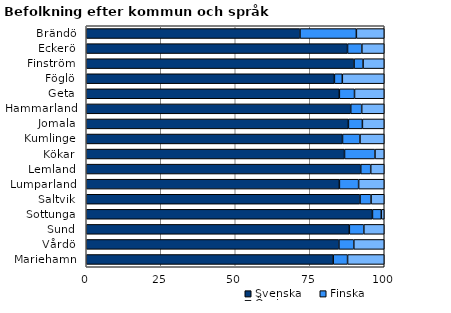
| Category | Svenska | Finska | Övriga |
|---|---|---|---|
| Brändö | 71.715 | 18.931 | 9.354 |
| Eckerö | 87.683 | 4.802 | 7.516 |
| Finström | 89.858 | 3.035 | 7.107 |
| Föglö | 83.27 | 2.662 | 14.068 |
| Geta | 84.932 | 5.088 | 9.98 |
| Hammarland | 88.743 | 3.69 | 7.567 |
| Jomala | 87.969 | 4.697 | 7.334 |
| Kumlinge | 85.993 | 5.863 | 8.143 |
| Kökar | 86.667 | 10.222 | 3.111 |
| Lemland | 92.1 | 3.359 | 4.541 |
| Lumparland | 84.946 | 6.452 | 8.602 |
| Saltvik | 91.86 | 3.71 | 4.43 |
| Sottunga | 96.04 | 2.97 | 0.99 |
| Sund | 88.282 | 4.866 | 6.852 |
| Vårdö | 84.783 | 5 | 10.217 |
| Mariehamn | 82.862 | 4.827 | 12.311 |